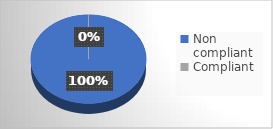
| Category | Series 0 |
|---|---|
| Non compliant | 8 |
| Compliant | 0 |